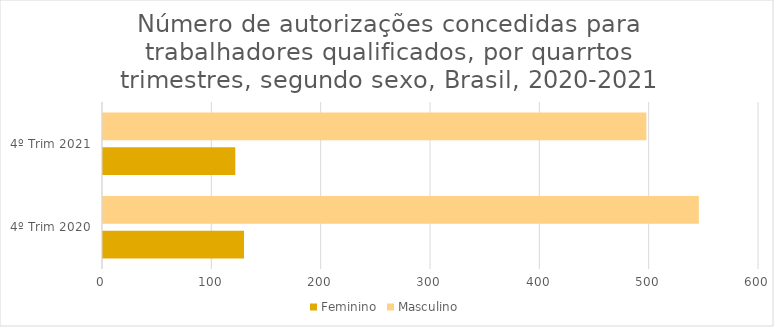
| Category | Feminino | Masculino |
|---|---|---|
| 4º Trim 2020 | 129 | 545 |
| 4º Trim 2021 | 121 | 497 |